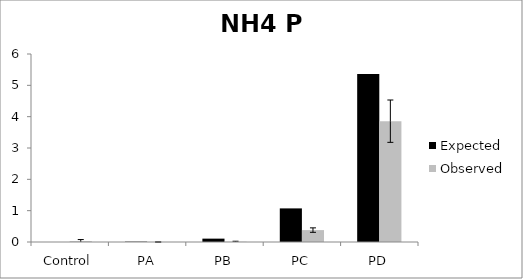
| Category | Expected | Observed |
|---|---|---|
| Control | 0 | 0.026 |
| PA | 0.011 | 0 |
| PB | 0.107 | 0.008 |
| PC | 1.073 | 0.38 |
| PD | 5.363 | 3.856 |